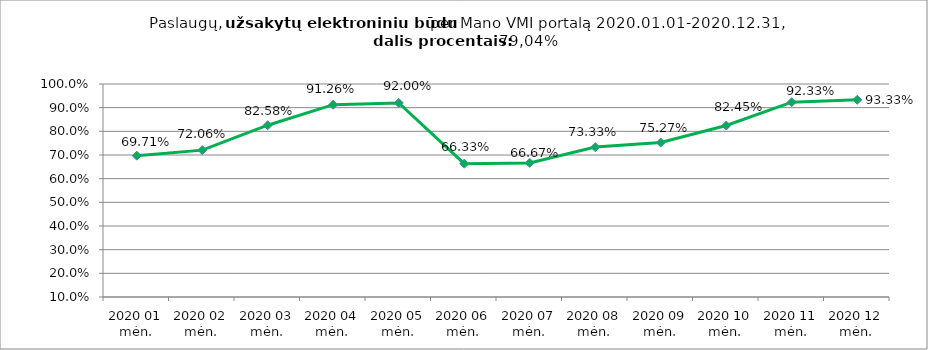
| Category | Elektroniniu būdu užsakytų paslaugų dalis procentais (lyginant su visomis Mano VMI portale užsakytomis paslaugomis) |
|---|---|
| 2020 01 mėn. | 0.697 |
| 2020 02 mėn. | 0.721 |
| 2020 03 mėn. | 0.826 |
| 2020 04 mėn. | 0.913 |
| 2020 05 mėn. | 0.92 |
| 2020 06 mėn. | 0.663 |
| 2020 07 mėn. | 0.667 |
| 2020 08 mėn. | 0.733 |
| 2020 09 mėn. | 0.753 |
| 2020 10 mėn. | 0.825 |
| 2020 11 mėn. | 0.923 |
| 2020 12 mėn. | 0.933 |